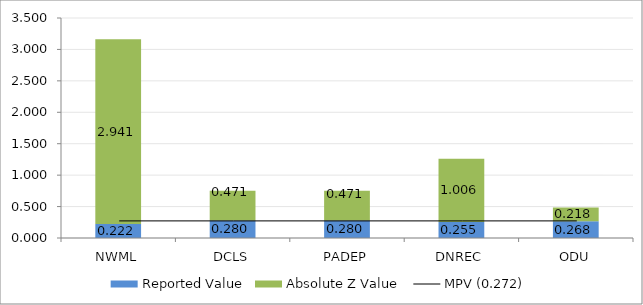
| Category | Reported Value | Absolute Z Value  |
|---|---|---|
| NWML | 0.222 | 2.941 |
| DCLS | 0.28 | 0.471 |
| PADEP | 0.28 | 0.471 |
| DNREC | 0.255 | 1.006 |
| ODU | 0.268 | 0.218 |